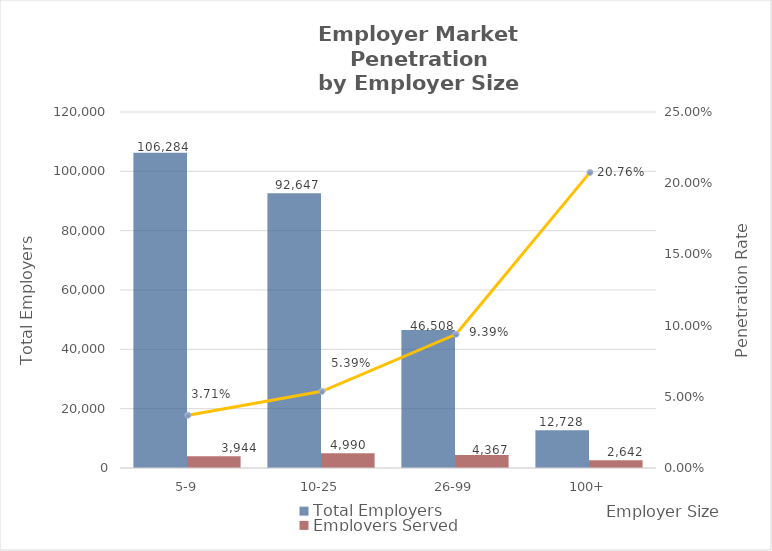
| Category | Total Employers | Employers Served |
|---|---|---|
| 5-9 | 106284 | 3944 |
| 10-25 | 92647 | 4990 |
| 26-99 | 46508 | 4367 |
| 100+ | 12728 | 2642 |